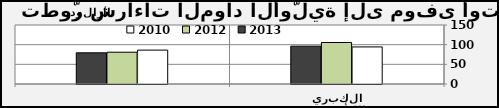
| Category | 2010 | 2012 | 2013 |
|---|---|---|---|
| 0 | 94.234 | 105.518 | 96.181 |
| 1 | 86.162 | 80.801 | 79.252 |